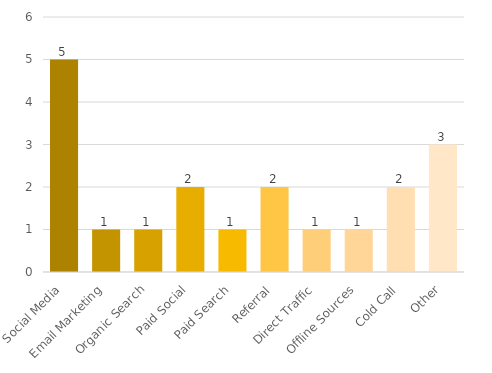
| Category | Series 0 |
|---|---|
| Social Media | 5 |
| Email Marketing | 1 |
| Organic Search | 1 |
| Paid Social | 2 |
| Paid Search | 1 |
| Referral | 2 |
| Direct Traffic | 1 |
| Offline Sources | 1 |
| Cold Call | 2 |
| Other | 3 |